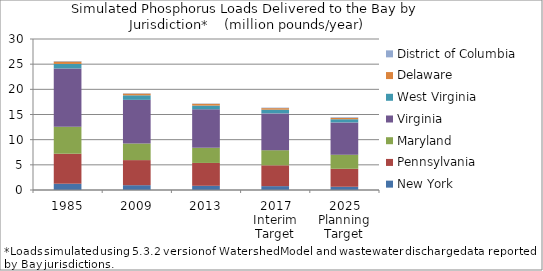
| Category | New York  | Pennsylvania  | Maryland  | Virginia  | West Virginia  | Delaware  | District of Columbia  |
|---|---|---|---|---|---|---|---|
| 1985 | 1.249 | 5.957 | 5.36 | 11.581 | 0.901 | 0.485 | 0.088 |
| 2009 | 0.956 | 4.984 | 3.301 | 8.672 | 0.899 | 0.345 | 0.071 |
| 2013 | 0.836 | 4.541 | 2.999 | 7.66 | 0.741 | 0.352 | 0.061 |
| 2017 Interim Target | 0.768 | 4.136 | 3.006 | 7.31 | 0.74 | 0.304 | 0.1 |
| 2025 Planning Target | 0.643 | 3.571 | 2.81 | 6.402 | 0.635 | 0.277 | 0.12 |